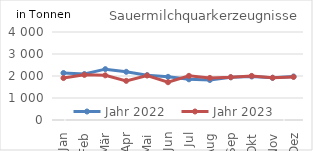
| Category | Jahr 2022 | Jahr 2023 |
|---|---|---|
| Jan | 2136.826 | 1906.492 |
| Feb | 2087.892 | 2051.203 |
| Mär | 2311.452 | 2030.05 |
| Apr | 2190.079 | 1779.532 |
| Mai | 2038.48 | 2022.517 |
| Jun | 1961.476 | 1716.999 |
| Jul | 1849.252 | 2006.927 |
| Aug | 1819.046 | 1912.529 |
| Sep | 1940.02 | 1946.861 |
| Okt | 1978.673 | 2004.324 |
| Nov | 1917.817 | 1920.655 |
| Dez | 1977.656 | 1957.053 |